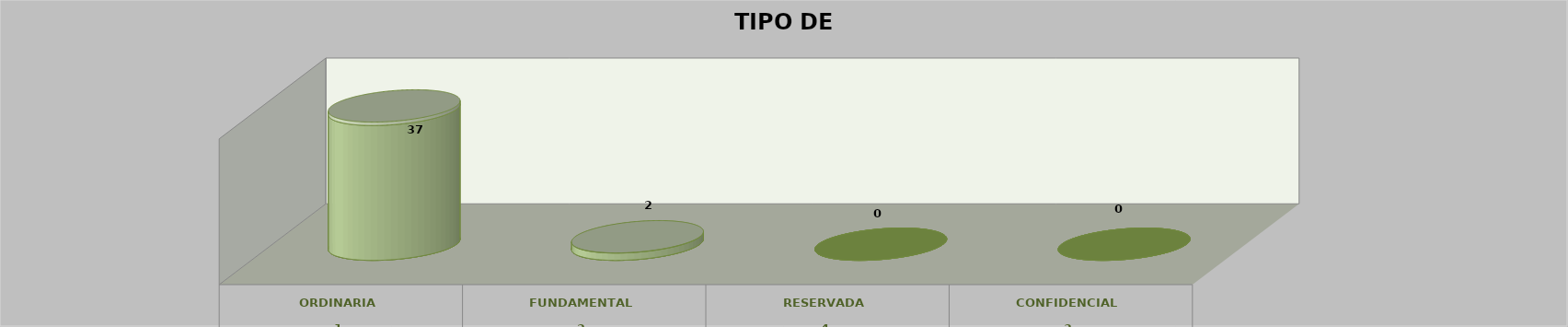
| Category | Series 0 | Series 1 | Series 2 | Series 3 | Series 4 |
|---|---|---|---|---|---|
| 0 |  |  |  | 37 | 0.949 |
| 1 |  |  |  | 2 | 0.051 |
| 2 |  |  |  | 0 | 0 |
| 3 |  |  |  | 0 | 0 |